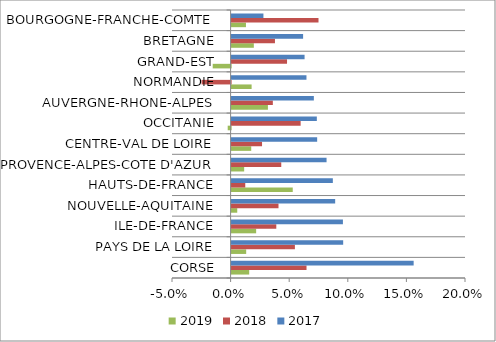
| Category | 2019 | 2018 | 2017 |
|---|---|---|---|
| CORSE | 0.015 | 0.064 | 0.155 |
| PAYS DE LA LOIRE | 0.012 | 0.054 | 0.095 |
| ILE-DE-FRANCE | 0.021 | 0.038 | 0.095 |
| NOUVELLE-AQUITAINE | 0.005 | 0.04 | 0.088 |
| HAUTS-DE-FRANCE | 0.052 | 0.012 | 0.086 |
| PROVENCE-ALPES-COTE D'AZUR | 0.011 | 0.042 | 0.081 |
| CENTRE-VAL DE LOIRE | 0.017 | 0.026 | 0.073 |
| OCCITANIE | -0.002 | 0.059 | 0.073 |
| AUVERGNE-RHONE-ALPES | 0.031 | 0.035 | 0.07 |
| NORMANDIE | 0.017 | -0.025 | 0.064 |
| GRAND-EST | -0.015 | 0.047 | 0.062 |
| BRETAGNE | 0.019 | 0.037 | 0.061 |
| BOURGOGNE-FRANCHE-COMTE | 0.012 | 0.074 | 0.027 |